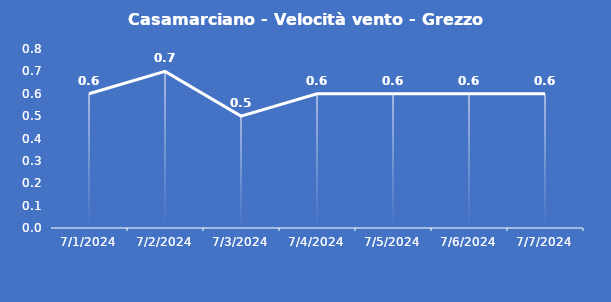
| Category | Casamarciano - Velocità vento - Grezzo (m/s) |
|---|---|
| 7/1/24 | 0.6 |
| 7/2/24 | 0.7 |
| 7/3/24 | 0.5 |
| 7/4/24 | 0.6 |
| 7/5/24 | 0.6 |
| 7/6/24 | 0.6 |
| 7/7/24 | 0.6 |